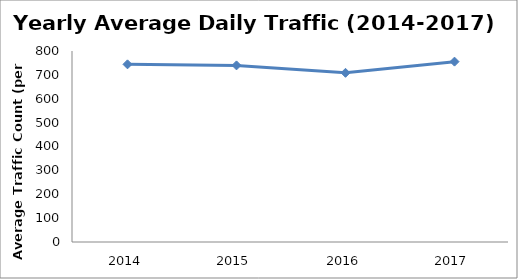
| Category | Series 0 |
|---|---|
| 2014.0 | 744.148 |
| 2015.0 | 739.685 |
| 2016.0 | 708.577 |
| 2017.0 | 755.455 |